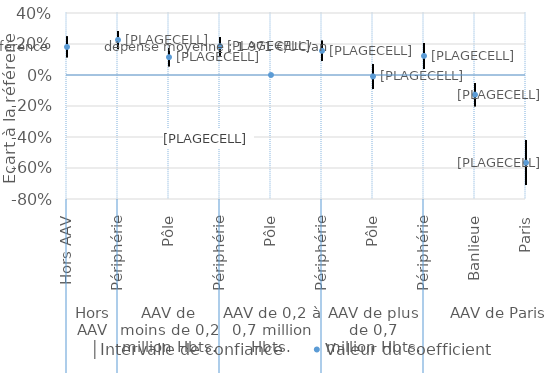
| Category | │Intervalle de confiance | Series 1 | Valeur du coefficient |
|---|---|---|---|
| 0 | 0.248 | 0.115 | 0.181 |
| 1 | 0.283 | 0.17 | 0.226 |
| 2 | 0.174 | 0.056 | 0.115 |
| 3 | 0.244 | 0.127 | 0.185 |
| 4 | 0 | 0 | 0 |
| 5 | 0.22 | 0.092 | 0.156 |
| 6 | 0.07 | -0.088 | -0.009 |
| 7 | 0.207 | 0.039 | 0.123 |
| 8 | -0.052 | -0.202 | -0.127 |
| 9 | -0.422 | -0.71 | -0.566 |